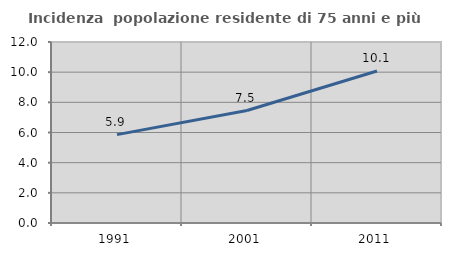
| Category | Incidenza  popolazione residente di 75 anni e più |
|---|---|
| 1991.0 | 5.86 |
| 2001.0 | 7.456 |
| 2011.0 | 10.077 |